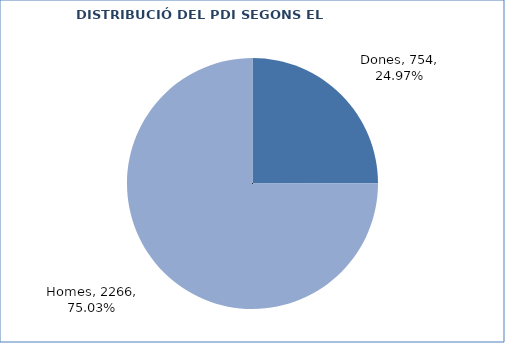
| Category | Series 0 |
|---|---|
| Dones | 754 |
| Homes | 2266 |